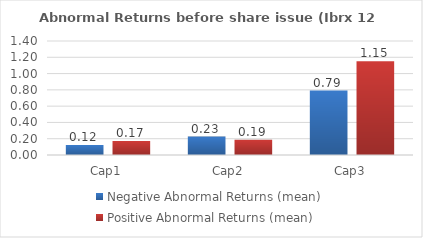
| Category | Negative Abnormal Returns (mean) | Positive Abnormal Returns (mean) |
|---|---|---|
| Cap1 | 0.122 | 0.171 |
| Cap2 | 0.227 | 0.189 |
| Cap3 | 0.792 | 1.153 |